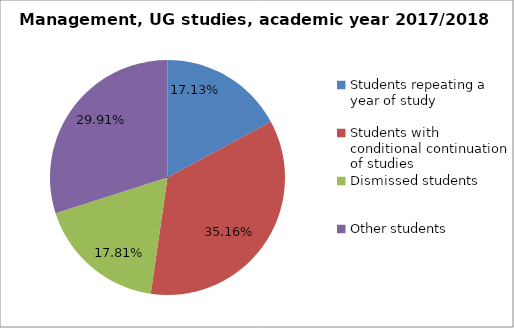
| Category | Series 0 |
|---|---|
| Students repeating a year of study | 75 |
| Students with conditional continuation of studies | 154 |
| Dismissed students | 78 |
| Other students | 131 |